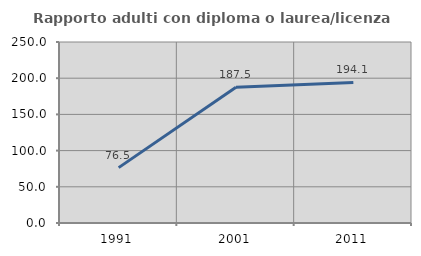
| Category | Rapporto adulti con diploma o laurea/licenza media  |
|---|---|
| 1991.0 | 76.471 |
| 2001.0 | 187.5 |
| 2011.0 | 194.118 |